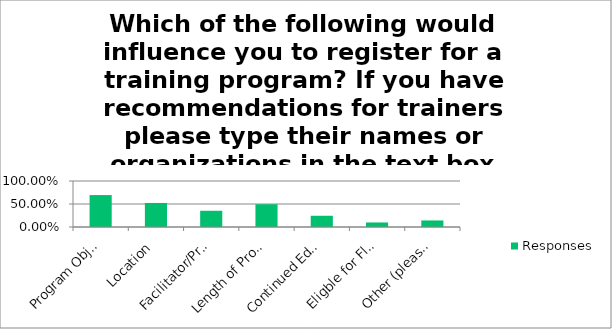
| Category | Responses |
|---|---|
| Program Objectives | 0.694 |
| Location | 0.523 |
| Facilitator/Presenter | 0.353 |
| Length of Program | 0.495 |
| Continued Education Credit Offered | 0.244 |
| Eligble for Flex Credit | 0.099 |
| Other (please specify) | 0.142 |